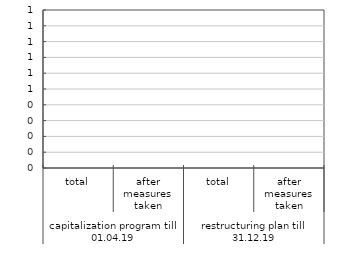
| Category | 25 |
|---|---|
| 0 | 0 |
| 1900-01-01 | 0 |
| 1900-01-02 | 0 |
| 1900-01-03 | 0 |